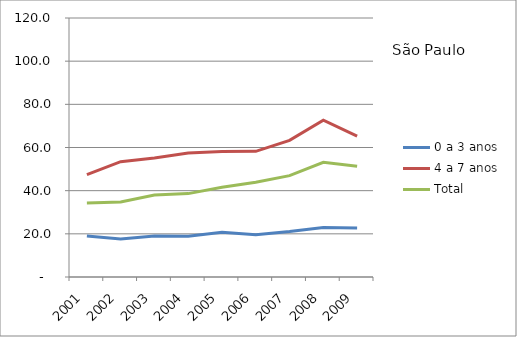
| Category | 0 a 3 anos | 4 a 7 anos | Total |
|---|---|---|---|
| 2001.0 | 19.05 | 47.39 | 34.32 |
| 2002.0 | 17.62 | 53.44 | 34.76 |
| 2003.0 | 19.01 | 55.12 | 37.98 |
| 2004.0 | 18.9 | 57.42 | 38.64 |
| 2005.0 | 20.71 | 58.18 | 41.55 |
| 2006.0 | 19.55 | 58.23 | 43.88 |
| 2007.0 | 21.04 | 63.31 | 46.97 |
| 2008.0 | 22.93 | 72.68 | 53.12 |
| 2009.0 | 22.66 | 65.32 | 51.29 |